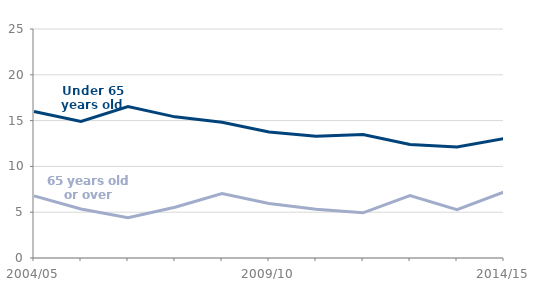
| Category | Under 65 years old | 65 years old or over |
|---|---|---|
| 2004/05 | 16003 | 6783 |
| 2005/06 | 14918 | 5349 |
| 2006/07 | 16527 | 4410 |
| 2007/08 | 15409 | 5549 |
| 2008/09 | 14809 | 7027 |
| 2009/10 | 13751 | 5957 |
| 2010/11 | 13287 | 5315 |
| 2011/12 | 13484 | 4934 |
| 2012/13 | 12382 | 6824 |
| 2013/14 | 12123 | 5268 |
| 2014/15 | 13036 | 7200 |